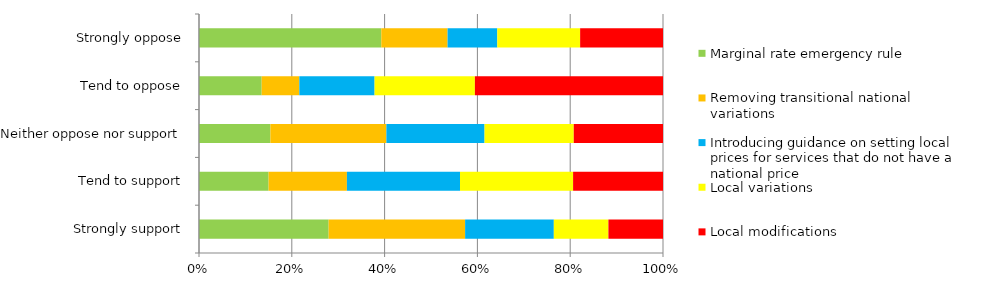
| Category | Marginal rate emergency rule | Removing transitional national variations | Introducing guidance on setting local prices for services that do not have a national price | Local variations | Local modifications |
|---|---|---|---|---|---|
| Strongly support | 19 | 20 | 13 | 8 | 8 |
| Tend to support | 24 | 27 | 39 | 39 | 31 |
| Neither oppose nor support | 8 | 13 | 11 | 10 | 10 |
| Tend to oppose | 5 | 3 | 6 | 8 | 15 |
| Strongly oppose | 11 | 4 | 3 | 5 | 5 |